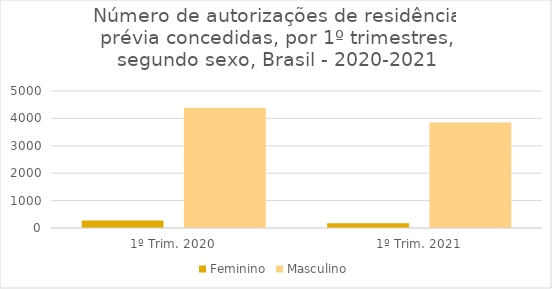
| Category | Feminino | Masculino |
|---|---|---|
| 1º Trim. 2020 | 271 | 4386 |
| 1º Trim. 2021 | 169 | 3848 |